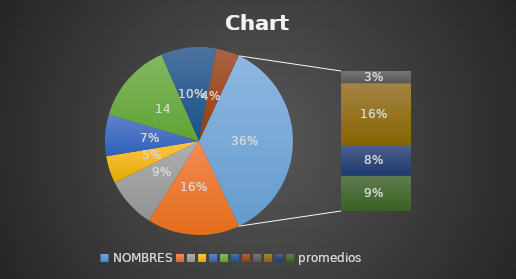
| Category | Series 0 | Series 1 | Series 2 | Series 3 | Series 4 |
|---|---|---|---|---|---|
| NOMBRES | 0 | 0 | 0 | 0 |  |
|  | 40 | 18 | 10 | 27 |  |
|  | 22 | 16 | 5 | 15 |  |
|  | 12 | 15 | 8 | 9 |  |
|  | 18 | 8 | 9 | 12 |  |
|  | 35 | 6 | 4 | 18 |  |
|  | 24 | 4 | 10 | 30 |  |
|  | 10 | 2 | 4 | 24 |  |
|  | 8 | 10 | 6 | 10 |  |
|  | 40 | 20 | 10 | 30 |  |
|  | 20 | 10 | 5 | 15 |  |
| promedios | 22.9 | 10.9 | 7.1 | 19 |  |